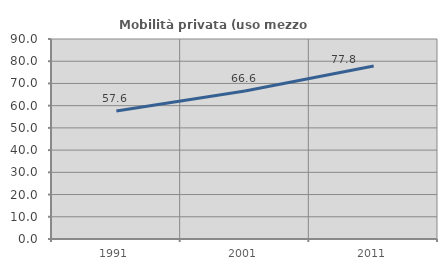
| Category | Mobilità privata (uso mezzo privato) |
|---|---|
| 1991.0 | 57.558 |
| 2001.0 | 66.631 |
| 2011.0 | 77.808 |